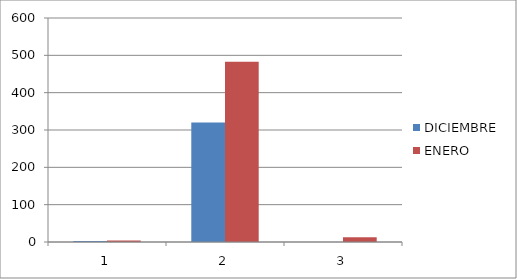
| Category | DICIEMBRE | ENERO |
|---|---|---|
| 0 | 3 | 4 |
| 1 | 320 | 483 |
| 2 | 0 | 13 |